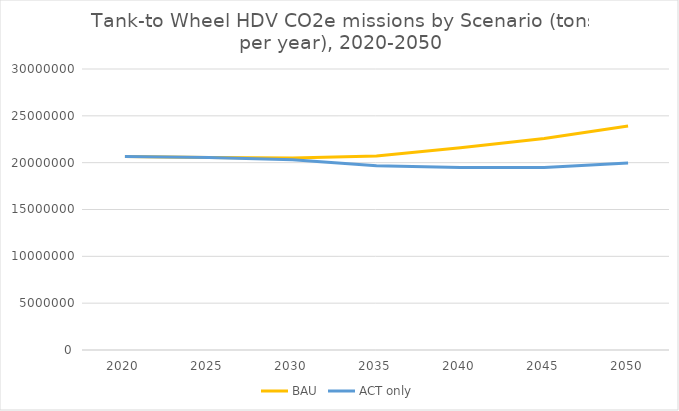
| Category | BAU | ACT only |
|---|---|---|
| 2020.0 | 20652032.773 | 20652032.773 |
| 2025.0 | 20561014.406 | 20561014.406 |
| 2030.0 | 20506774.5 | 20310251.082 |
| 2035.0 | 20717153.604 | 19667437.799 |
| 2040.0 | 21584127.333 | 19470844.877 |
| 2045.0 | 22572304.434 | 19474596.053 |
| 2050.0 | 23922724.488 | 19976293.817 |